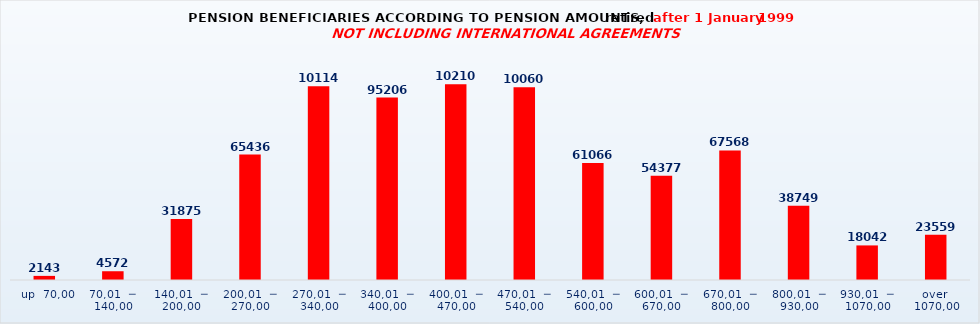
| Category | Series 0 |
|---|---|
|   up  70,00 | 2143 |
| 70,01  ─  140,00 | 4572 |
| 140,01  ─  200,00 | 31875 |
| 200,01  ─  270,00 | 65436 |
| 270,01  ─  340,00 | 101140 |
| 340,01  ─  400,00 | 95206 |
| 400,01  ─  470,00 | 102105 |
| 470,01  ─  540,00 | 100606 |
| 540,01  ─  600,00 | 61066 |
| 600,01  ─  670,00 | 54377 |
| 670,01  ─  800,00 | 67568 |
| 800,01  ─  930,00 | 38749 |
| 930,01  ─  1070,00 | 18042 |
| over  1070,00 | 23559 |